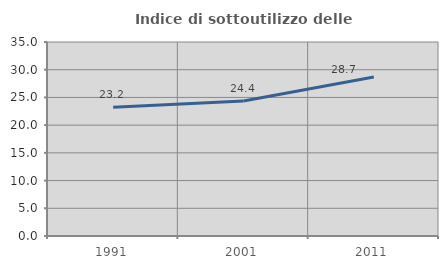
| Category | Indice di sottoutilizzo delle abitazioni  |
|---|---|
| 1991.0 | 23.214 |
| 2001.0 | 24.361 |
| 2011.0 | 28.688 |